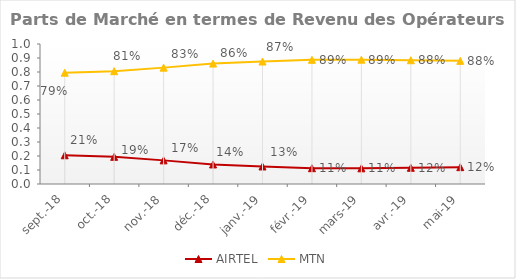
| Category | AIRTEL | MTN |
|---|---|---|
| sept.-18 | 0.205 | 0.795 |
| oct.-18 | 0.194 | 0.806 |
| nov.-18 | 0.169 | 0.831 |
| déc.-18 | 0.14 | 0.86 |
| janv.-19 | 0.125 | 0.875 |
| févr.-19 | 0.113 | 0.887 |
| mars-19 | 0.112 | 0.888 |
| avr.-19 | 0.116 | 0.884 |
| mai-19 | 0.12 | 0.88 |